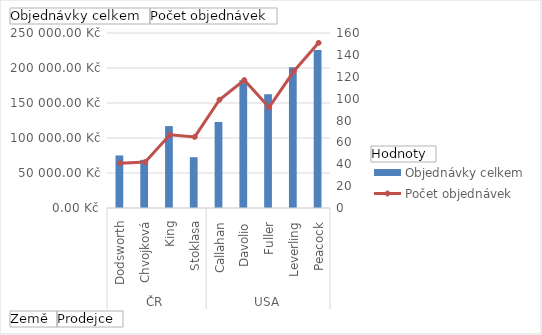
| Category | Objednávky celkem |
|---|---|
| 0 | 75048.04 |
| 1 | 68792.25 |
| 2 | 116962.99 |
| 3 | 72527.63 |
| 4 | 123032.67 |
| 5 | 182500.09 |
| 6 | 162503.78 |
| 7 | 201196.27 |
| 8 | 225763.68 |